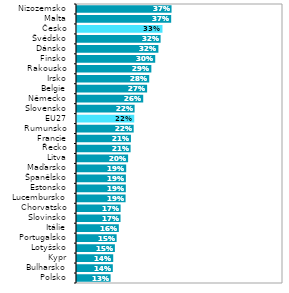
| Category | Series 1 |
|---|---|
| Polsko | 0.13 |
| Bulharsko | 0.139 |
| Kypr | 0.141 |
| Lotyšsko | 0.147 |
| Portugalsko | 0.154 |
| Itálie | 0.162 |
| Slovinsko | 0.169 |
| Chorvatsko | 0.169 |
| Lucembursko | 0.189 |
| Estonsko | 0.19 |
| Španělsko | 0.19 |
| Maďarsko | 0.191 |
| Litva | 0.198 |
| Řecko | 0.208 |
| Francie | 0.21 |
| Rumunsko | 0.22 |
| EU27 | 0.222 |
| Slovensko | 0.224 |
| Německo | 0.257 |
| Belgie | 0.272 |
| Irsko | 0.28 |
| Rakousko | 0.289 |
| Finsko | 0.304 |
| Dánsko | 0.316 |
| Švédsko | 0.325 |
| Česko | 0.332 |
| Malta | 0.366 |
| Nizozemsko | 0.367 |